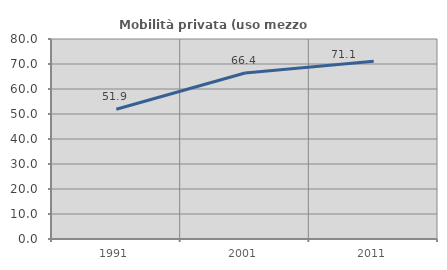
| Category | Mobilità privata (uso mezzo privato) |
|---|---|
| 1991.0 | 51.881 |
| 2001.0 | 66.404 |
| 2011.0 | 71.106 |